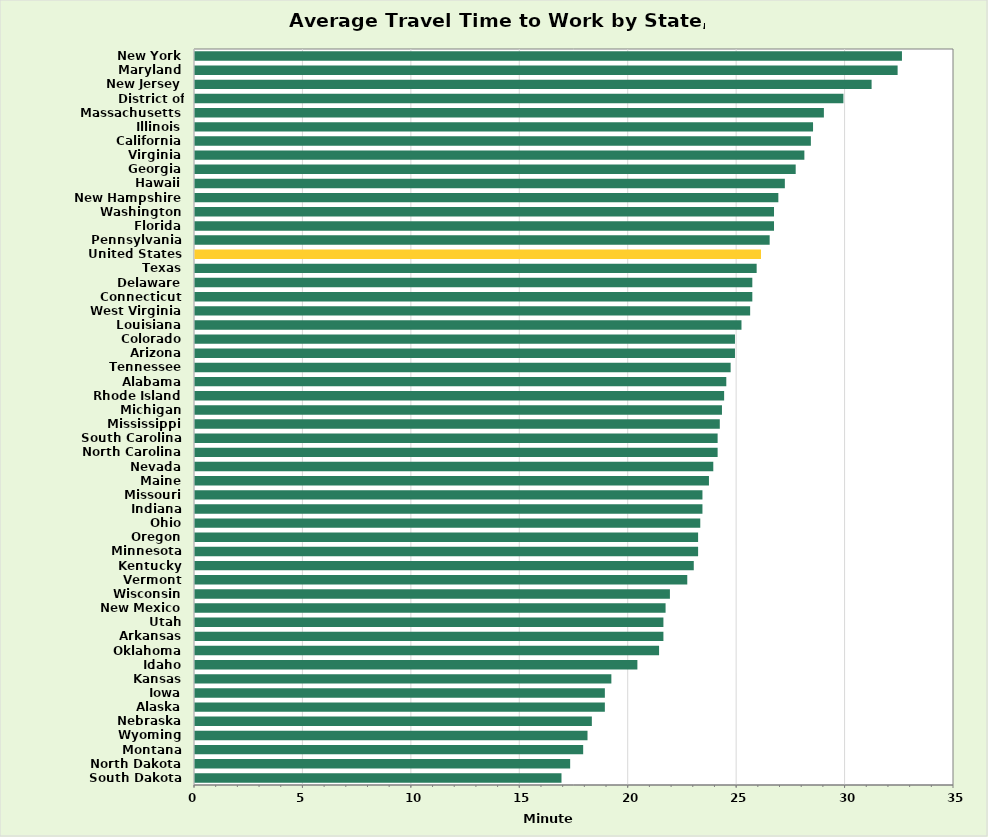
| Category | Minutes |
|---|---|
| South Dakota | 16.9 |
| North Dakota | 17.3 |
| Montana | 17.9 |
| Wyoming | 18.1 |
| Nebraska | 18.3 |
| Alaska | 18.9 |
| Iowa | 18.9 |
| Kansas | 19.2 |
| Idaho | 20.4 |
| Oklahoma | 21.4 |
| Arkansas | 21.6 |
| Utah | 21.6 |
| New Mexico | 21.7 |
| Wisconsin | 21.9 |
| Vermont | 22.7 |
| Kentucky | 23 |
| Minnesota | 23.2 |
| Oregon | 23.2 |
| Ohio | 23.3 |
| Indiana | 23.4 |
| Missouri | 23.4 |
| Maine | 23.7 |
| Nevada | 23.9 |
| North Carolina | 24.1 |
| South Carolina | 24.1 |
| Mississippi | 24.2 |
| Michigan | 24.3 |
| Rhode Island | 24.4 |
| Alabama | 24.5 |
| Tennessee | 24.7 |
| Arizona | 24.9 |
| Colorado | 24.9 |
| Louisiana | 25.2 |
| West Virginia | 25.6 |
| Connecticut | 25.7 |
| Delaware | 25.7 |
| Texas | 25.9 |
| United States | 26.1 |
| Pennsylvania | 26.5 |
| Florida | 26.7 |
| Washington | 26.7 |
| New Hampshire | 26.9 |
| Hawaii | 27.2 |
| Georgia | 27.7 |
| Virginia | 28.1 |
| California | 28.4 |
| Illinois | 28.5 |
| Massachusetts | 29 |
| District of Columbia | 29.9 |
| New Jersey | 31.2 |
| Maryland | 32.4 |
| New York | 32.6 |